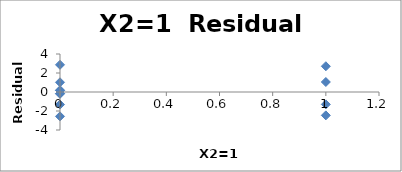
| Category | Series 0 |
|---|---|
| 1.0 | 2.71 |
| 1.0 | 1.053 |
| 1.0 | -1.303 |
| 1.0 | -2.46 |
| 0.0 | 0.185 |
| 0.0 | -0.172 |
| 0.0 | 0.172 |
| 0.0 | -0.185 |
| 0.0 | -2.565 |
| 0.0 | -1.322 |
| 0.0 | 1.022 |
| 0.0 | 2.865 |